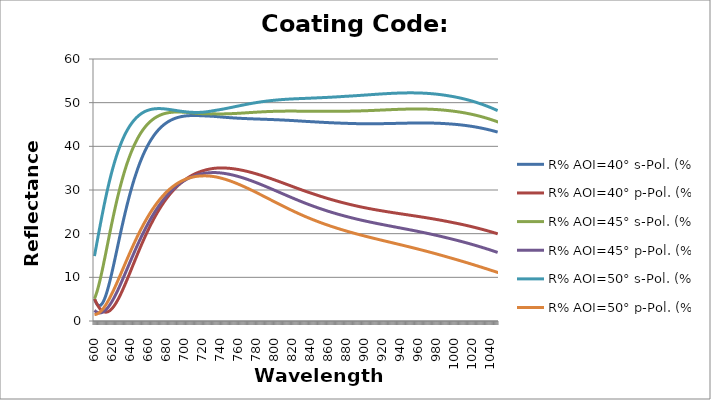
| Category | R% AOI=40° s-Pol. (%) | R% AOI=40° p-Pol. (%) | R% AOI=45° s-Pol. (%) | R% AOI=45° p-Pol. (%) | R% AOI=50° s-Pol. (%) | R% AOI=50° p-Pol. (%) |
|---|---|---|---|---|---|---|
| 600.0 | 5.073 | 5.115 | 5.1 | 2.43 | 14.871 | 1.455 |
| 601.0 | 4.541 | 4.637 | 5.6 | 2.245 | 15.971 | 1.478 |
| 602.0 | 4.118 | 4.199 | 6.181 | 2.094 | 17.081 | 1.531 |
| 603.0 | 3.806 | 3.8 | 6.838 | 1.979 | 18.195 | 1.613 |
| 604.0 | 3.601 | 3.441 | 7.562 | 1.899 | 19.307 | 1.723 |
| 605.0 | 3.503 | 3.123 | 8.346 | 1.853 | 20.414 | 1.861 |
| 606.0 | 3.508 | 2.845 | 9.182 | 1.84 | 21.511 | 2.025 |
| 607.0 | 3.613 | 2.608 | 10.064 | 1.86 | 22.596 | 2.214 |
| 608.0 | 3.813 | 2.411 | 10.984 | 1.913 | 23.664 | 2.427 |
| 609.0 | 4.103 | 2.254 | 11.935 | 1.996 | 24.714 | 2.664 |
| 610.0 | 4.479 | 2.137 | 12.912 | 2.109 | 25.744 | 2.924 |
| 611.0 | 4.933 | 2.059 | 13.909 | 2.252 | 26.751 | 3.204 |
| 612.0 | 5.461 | 2.018 | 14.92 | 2.422 | 27.734 | 3.505 |
| 613.0 | 6.056 | 2.016 | 15.941 | 2.619 | 28.693 | 3.824 |
| 614.0 | 6.712 | 2.05 | 16.966 | 2.842 | 29.625 | 4.162 |
| 615.0 | 7.423 | 2.118 | 17.992 | 3.089 | 30.531 | 4.516 |
| 616.0 | 8.182 | 2.222 | 19.016 | 3.359 | 31.41 | 4.886 |
| 617.0 | 8.984 | 2.358 | 20.032 | 3.651 | 32.261 | 5.27 |
| 618.0 | 9.822 | 2.526 | 21.04 | 3.964 | 33.085 | 5.668 |
| 619.0 | 10.692 | 2.724 | 22.035 | 4.296 | 33.881 | 6.077 |
| 620.0 | 11.587 | 2.951 | 23.016 | 4.646 | 34.649 | 6.498 |
| 621.0 | 12.504 | 3.205 | 23.981 | 5.013 | 35.39 | 6.93 |
| 622.0 | 13.436 | 3.485 | 24.928 | 5.395 | 36.104 | 7.37 |
| 623.0 | 14.38 | 3.79 | 25.856 | 5.792 | 36.791 | 7.818 |
| 624.0 | 15.332 | 4.117 | 26.764 | 6.202 | 37.451 | 8.274 |
| 625.0 | 16.287 | 4.466 | 27.65 | 6.624 | 38.086 | 8.736 |
| 626.0 | 17.243 | 4.835 | 28.514 | 7.056 | 38.695 | 9.203 |
| 627.0 | 18.197 | 5.223 | 29.356 | 7.498 | 39.279 | 9.675 |
| 628.0 | 19.145 | 5.627 | 30.174 | 7.949 | 39.839 | 10.15 |
| 629.0 | 20.086 | 6.047 | 30.968 | 8.407 | 40.375 | 10.628 |
| 630.0 | 21.016 | 6.481 | 31.739 | 8.872 | 40.887 | 11.108 |
| 631.0 | 21.935 | 6.927 | 32.486 | 9.342 | 41.377 | 11.59 |
| 632.0 | 22.84 | 7.386 | 33.21 | 9.818 | 41.845 | 12.072 |
| 633.0 | 23.732 | 7.855 | 33.911 | 10.297 | 42.292 | 12.556 |
| 634.0 | 24.605 | 8.331 | 34.587 | 10.778 | 42.718 | 13.038 |
| 635.0 | 25.458 | 8.814 | 35.238 | 11.26 | 43.122 | 13.517 |
| 636.0 | 26.293 | 9.303 | 35.866 | 11.744 | 43.507 | 13.995 |
| 637.0 | 27.109 | 9.798 | 36.472 | 12.228 | 43.873 | 14.47 |
| 638.0 | 27.906 | 10.297 | 37.056 | 12.712 | 44.221 | 14.943 |
| 639.0 | 28.683 | 10.8 | 37.619 | 13.195 | 44.551 | 15.413 |
| 640.0 | 29.44 | 11.305 | 38.16 | 13.677 | 44.864 | 15.88 |
| 641.0 | 30.176 | 11.812 | 38.68 | 14.158 | 45.16 | 16.342 |
| 642.0 | 30.892 | 12.32 | 39.18 | 14.636 | 45.441 | 16.801 |
| 643.0 | 31.588 | 12.827 | 39.661 | 15.111 | 45.706 | 17.254 |
| 644.0 | 32.263 | 13.334 | 40.122 | 15.583 | 45.955 | 17.703 |
| 645.0 | 32.917 | 13.84 | 40.564 | 16.051 | 46.19 | 18.147 |
| 646.0 | 33.551 | 14.343 | 40.988 | 16.515 | 46.412 | 18.585 |
| 647.0 | 34.165 | 14.844 | 41.394 | 16.975 | 46.619 | 19.018 |
| 648.0 | 34.759 | 15.342 | 41.782 | 17.43 | 46.814 | 19.445 |
| 649.0 | 35.333 | 15.836 | 42.154 | 17.88 | 46.996 | 19.866 |
| 650.0 | 35.888 | 16.326 | 42.509 | 18.325 | 47.166 | 20.28 |
| 651.0 | 36.423 | 16.811 | 42.848 | 18.764 | 47.324 | 20.688 |
| 652.0 | 36.94 | 17.292 | 43.171 | 19.197 | 47.471 | 21.09 |
| 653.0 | 37.439 | 17.766 | 43.48 | 19.624 | 47.607 | 21.484 |
| 654.0 | 37.919 | 18.236 | 43.773 | 20.045 | 47.733 | 21.872 |
| 655.0 | 38.382 | 18.7 | 44.053 | 20.46 | 47.848 | 22.254 |
| 656.0 | 38.828 | 19.157 | 44.319 | 20.868 | 47.954 | 22.628 |
| 657.0 | 39.256 | 19.608 | 44.572 | 21.269 | 48.051 | 22.995 |
| 658.0 | 39.668 | 20.052 | 44.812 | 21.664 | 48.139 | 23.355 |
| 659.0 | 40.065 | 20.489 | 45.039 | 22.052 | 48.219 | 23.708 |
| 660.0 | 40.445 | 20.92 | 45.255 | 22.433 | 48.291 | 24.053 |
| 661.0 | 40.81 | 21.343 | 45.459 | 22.807 | 48.354 | 24.392 |
| 662.0 | 41.161 | 21.759 | 45.651 | 23.174 | 48.411 | 24.723 |
| 663.0 | 41.497 | 22.168 | 45.833 | 23.534 | 48.46 | 25.047 |
| 664.0 | 41.819 | 22.569 | 46.005 | 23.887 | 48.503 | 25.364 |
| 665.0 | 42.127 | 22.963 | 46.166 | 24.233 | 48.54 | 25.674 |
| 666.0 | 42.422 | 23.349 | 46.318 | 24.571 | 48.57 | 25.976 |
| 667.0 | 42.704 | 23.728 | 46.46 | 24.903 | 48.595 | 26.271 |
| 668.0 | 42.974 | 24.099 | 46.593 | 25.227 | 48.614 | 26.559 |
| 669.0 | 43.232 | 24.463 | 46.717 | 25.544 | 48.629 | 26.84 |
| 670.0 | 43.477 | 24.819 | 46.834 | 25.854 | 48.638 | 27.114 |
| 671.0 | 43.712 | 25.167 | 46.942 | 26.158 | 48.643 | 27.381 |
| 672.0 | 43.935 | 25.508 | 47.042 | 26.454 | 48.644 | 27.641 |
| 673.0 | 44.147 | 25.841 | 47.135 | 26.743 | 48.641 | 27.894 |
| 674.0 | 44.349 | 26.166 | 47.221 | 27.025 | 48.634 | 28.14 |
| 675.0 | 44.542 | 26.484 | 47.3 | 27.3 | 48.624 | 28.379 |
| 676.0 | 44.724 | 26.795 | 47.373 | 27.569 | 48.611 | 28.611 |
| 677.0 | 44.897 | 27.098 | 47.439 | 27.83 | 48.595 | 28.837 |
| 678.0 | 45.061 | 27.394 | 47.5 | 28.085 | 48.577 | 29.056 |
| 679.0 | 45.216 | 27.683 | 47.554 | 28.334 | 48.556 | 29.268 |
| 680.0 | 45.362 | 27.965 | 47.604 | 28.576 | 48.533 | 29.474 |
| 681.0 | 45.501 | 28.239 | 47.648 | 28.811 | 48.508 | 29.674 |
| 682.0 | 45.631 | 28.507 | 47.687 | 29.04 | 48.481 | 29.867 |
| 683.0 | 45.754 | 28.767 | 47.721 | 29.262 | 48.453 | 30.054 |
| 684.0 | 45.87 | 29.021 | 47.752 | 29.478 | 48.424 | 30.234 |
| 685.0 | 45.978 | 29.268 | 47.777 | 29.688 | 48.394 | 30.409 |
| 686.0 | 46.08 | 29.508 | 47.799 | 29.892 | 48.363 | 30.577 |
| 687.0 | 46.175 | 29.742 | 47.818 | 30.089 | 48.331 | 30.739 |
| 688.0 | 46.264 | 29.969 | 47.832 | 30.281 | 48.299 | 30.896 |
| 689.0 | 46.346 | 30.189 | 47.844 | 30.467 | 48.267 | 31.046 |
| 690.0 | 46.423 | 30.404 | 47.852 | 30.647 | 48.234 | 31.191 |
| 691.0 | 46.495 | 30.612 | 47.858 | 30.821 | 48.202 | 31.33 |
| 692.0 | 46.56 | 30.814 | 47.86 | 30.989 | 48.17 | 31.463 |
| 693.0 | 46.621 | 31.01 | 47.861 | 31.152 | 48.138 | 31.591 |
| 694.0 | 46.677 | 31.2 | 47.859 | 31.31 | 48.107 | 31.714 |
| 695.0 | 46.728 | 31.384 | 47.854 | 31.461 | 48.077 | 31.831 |
| 696.0 | 46.775 | 31.562 | 47.848 | 31.608 | 48.048 | 31.942 |
| 697.0 | 46.817 | 31.735 | 47.84 | 31.749 | 48.019 | 32.049 |
| 698.0 | 46.855 | 31.902 | 47.831 | 31.885 | 47.991 | 32.15 |
| 699.0 | 46.89 | 32.064 | 47.82 | 32.016 | 47.965 | 32.246 |
| 700.0 | 46.92 | 32.22 | 47.808 | 32.142 | 47.94 | 32.338 |
| 701.0 | 46.947 | 32.371 | 47.794 | 32.263 | 47.916 | 32.424 |
| 702.0 | 46.971 | 32.517 | 47.779 | 32.379 | 47.894 | 32.505 |
| 703.0 | 46.991 | 32.658 | 47.764 | 32.49 | 47.873 | 32.582 |
| 704.0 | 47.009 | 32.793 | 47.748 | 32.597 | 47.854 | 32.654 |
| 705.0 | 47.023 | 32.924 | 47.731 | 32.699 | 47.836 | 32.721 |
| 706.0 | 47.035 | 33.05 | 47.714 | 32.796 | 47.82 | 32.784 |
| 707.0 | 47.044 | 33.171 | 47.696 | 32.888 | 47.806 | 32.842 |
| 708.0 | 47.051 | 33.287 | 47.678 | 32.977 | 47.794 | 32.896 |
| 709.0 | 47.056 | 33.399 | 47.66 | 33.061 | 47.784 | 32.946 |
| 710.0 | 47.059 | 33.506 | 47.642 | 33.14 | 47.776 | 32.991 |
| 711.0 | 47.059 | 33.609 | 47.624 | 33.216 | 47.769 | 33.032 |
| 712.0 | 47.058 | 33.708 | 47.606 | 33.287 | 47.765 | 33.069 |
| 713.0 | 47.055 | 33.802 | 47.588 | 33.354 | 47.762 | 33.102 |
| 714.0 | 47.05 | 33.892 | 47.571 | 33.417 | 47.762 | 33.131 |
| 715.0 | 47.044 | 33.978 | 47.554 | 33.476 | 47.764 | 33.156 |
| 716.0 | 47.037 | 34.06 | 47.537 | 33.532 | 47.767 | 33.178 |
| 717.0 | 47.029 | 34.138 | 47.521 | 33.583 | 47.772 | 33.195 |
| 718.0 | 47.019 | 34.212 | 47.505 | 33.631 | 47.78 | 33.209 |
| 719.0 | 47.008 | 34.282 | 47.49 | 33.675 | 47.789 | 33.219 |
| 720.0 | 47 | 34.351 | 47.48 | 33.718 | 47.805 | 33.228 |
| 721.0 | 46.992 | 34.417 | 47.471 | 33.759 | 47.823 | 33.235 |
| 722.0 | 46.983 | 34.48 | 47.463 | 33.796 | 47.843 | 33.238 |
| 723.0 | 46.974 | 34.539 | 47.456 | 33.829 | 47.865 | 33.239 |
| 724.0 | 46.964 | 34.595 | 47.45 | 33.86 | 47.889 | 33.236 |
| 725.0 | 46.954 | 34.647 | 47.444 | 33.887 | 47.914 | 33.229 |
| 726.0 | 46.944 | 34.696 | 47.44 | 33.911 | 47.942 | 33.22 |
| 727.0 | 46.933 | 34.742 | 47.436 | 33.932 | 47.971 | 33.208 |
| 728.0 | 46.922 | 34.786 | 47.434 | 33.95 | 48.001 | 33.192 |
| 729.0 | 46.911 | 34.825 | 47.432 | 33.965 | 48.034 | 33.174 |
| 730.0 | 46.9 | 34.862 | 47.432 | 33.977 | 48.068 | 33.153 |
| 731.0 | 46.888 | 34.896 | 47.432 | 33.986 | 48.103 | 33.129 |
| 732.0 | 46.877 | 34.927 | 47.434 | 33.992 | 48.14 | 33.102 |
| 733.0 | 46.866 | 34.956 | 47.436 | 33.996 | 48.178 | 33.072 |
| 734.0 | 46.852 | 34.98 | 47.437 | 33.995 | 48.214 | 33.039 |
| 735.0 | 46.834 | 34.997 | 47.433 | 33.988 | 48.245 | 33.001 |
| 736.0 | 46.815 | 35.012 | 47.429 | 33.979 | 48.276 | 32.96 |
| 737.0 | 46.796 | 35.025 | 47.427 | 33.968 | 48.309 | 32.916 |
| 738.0 | 46.778 | 35.034 | 47.425 | 33.954 | 48.343 | 32.87 |
| 739.0 | 46.76 | 35.042 | 47.424 | 33.937 | 48.378 | 32.822 |
| 740.0 | 46.742 | 35.046 | 47.424 | 33.918 | 48.414 | 32.772 |
| 741.0 | 46.724 | 35.049 | 47.424 | 33.896 | 48.45 | 32.719 |
| 742.0 | 46.706 | 35.049 | 47.426 | 33.873 | 48.487 | 32.664 |
| 743.0 | 46.689 | 35.047 | 47.428 | 33.847 | 48.525 | 32.608 |
| 744.0 | 46.672 | 35.042 | 47.431 | 33.819 | 48.564 | 32.549 |
| 745.0 | 46.655 | 35.035 | 47.434 | 33.789 | 48.603 | 32.487 |
| 746.0 | 46.638 | 35.026 | 47.439 | 33.756 | 48.643 | 32.425 |
| 747.0 | 46.622 | 35.015 | 47.444 | 33.722 | 48.684 | 32.36 |
| 748.0 | 46.606 | 35.002 | 47.45 | 33.685 | 48.724 | 32.293 |
| 749.0 | 46.59 | 34.987 | 47.456 | 33.647 | 48.766 | 32.224 |
| 750.0 | 46.575 | 34.969 | 47.463 | 33.606 | 48.807 | 32.154 |
| 751.0 | 46.56 | 34.95 | 47.471 | 33.564 | 48.849 | 32.082 |
| 752.0 | 46.546 | 34.929 | 47.479 | 33.52 | 48.891 | 32.008 |
| 753.0 | 46.532 | 34.906 | 47.488 | 33.474 | 48.934 | 31.933 |
| 754.0 | 46.518 | 34.881 | 47.497 | 33.426 | 48.976 | 31.856 |
| 755.0 | 46.505 | 34.854 | 47.507 | 33.377 | 49.019 | 31.778 |
| 756.0 | 46.492 | 34.826 | 47.517 | 33.326 | 49.061 | 31.698 |
| 757.0 | 46.479 | 34.796 | 47.527 | 33.273 | 49.104 | 31.616 |
| 758.0 | 46.467 | 34.764 | 47.538 | 33.219 | 49.147 | 31.534 |
| 759.0 | 46.455 | 34.73 | 47.55 | 33.163 | 49.189 | 31.449 |
| 760.0 | 46.443 | 34.695 | 47.561 | 33.106 | 49.232 | 31.364 |
| 761.0 | 46.432 | 34.659 | 47.573 | 33.047 | 49.274 | 31.277 |
| 762.0 | 46.421 | 34.62 | 47.585 | 32.987 | 49.316 | 31.19 |
| 763.0 | 46.41 | 34.581 | 47.598 | 32.925 | 49.358 | 31.101 |
| 764.0 | 46.4 | 34.54 | 47.611 | 32.862 | 49.4 | 31.01 |
| 765.0 | 46.39 | 34.497 | 47.623 | 32.798 | 49.441 | 30.919 |
| 766.0 | 46.38 | 34.453 | 47.636 | 32.732 | 49.482 | 30.827 |
| 767.0 | 46.37 | 34.408 | 47.65 | 32.665 | 49.523 | 30.734 |
| 768.0 | 46.361 | 34.361 | 47.663 | 32.597 | 49.563 | 30.64 |
| 769.0 | 46.352 | 34.313 | 47.676 | 32.528 | 49.603 | 30.545 |
| 770.0 | 46.343 | 34.264 | 47.69 | 32.458 | 49.643 | 30.449 |
| 771.0 | 46.335 | 34.213 | 47.703 | 32.386 | 49.682 | 30.352 |
| 772.0 | 46.326 | 34.162 | 47.716 | 32.314 | 49.72 | 30.254 |
| 773.0 | 46.318 | 34.109 | 47.73 | 32.241 | 49.758 | 30.156 |
| 774.0 | 46.31 | 34.055 | 47.743 | 32.166 | 49.796 | 30.057 |
| 775.0 | 46.302 | 34 | 47.756 | 32.091 | 49.832 | 29.958 |
| 776.0 | 46.294 | 33.944 | 47.769 | 32.014 | 49.869 | 29.857 |
| 777.0 | 46.286 | 33.886 | 47.782 | 31.937 | 49.905 | 29.756 |
| 778.0 | 46.279 | 33.828 | 47.795 | 31.859 | 49.94 | 29.655 |
| 779.0 | 46.271 | 33.769 | 47.808 | 31.78 | 49.974 | 29.553 |
| 780.0 | 46.264 | 33.709 | 47.82 | 31.701 | 50.008 | 29.45 |
| 781.0 | 46.257 | 33.648 | 47.833 | 31.62 | 50.042 | 29.348 |
| 782.0 | 46.25 | 33.586 | 47.845 | 31.539 | 50.074 | 29.244 |
| 783.0 | 46.242 | 33.523 | 47.857 | 31.458 | 50.106 | 29.141 |
| 784.0 | 46.235 | 33.46 | 47.869 | 31.375 | 50.138 | 29.036 |
| 785.0 | 46.228 | 33.395 | 47.88 | 31.292 | 50.168 | 28.932 |
| 786.0 | 46.221 | 33.33 | 47.891 | 31.209 | 50.198 | 28.828 |
| 787.0 | 46.213 | 33.264 | 47.902 | 31.124 | 50.228 | 28.723 |
| 788.0 | 46.206 | 33.198 | 47.913 | 31.04 | 50.256 | 28.618 |
| 789.0 | 46.199 | 33.13 | 47.923 | 30.955 | 50.284 | 28.512 |
| 790.0 | 46.191 | 33.062 | 47.933 | 30.869 | 50.312 | 28.407 |
| 791.0 | 46.184 | 32.994 | 47.942 | 30.783 | 50.338 | 28.302 |
| 792.0 | 46.176 | 32.924 | 47.952 | 30.697 | 50.364 | 28.196 |
| 793.0 | 46.169 | 32.854 | 47.961 | 30.61 | 50.39 | 28.09 |
| 794.0 | 46.161 | 32.784 | 47.969 | 30.523 | 50.414 | 27.984 |
| 795.0 | 46.153 | 32.713 | 47.977 | 30.435 | 50.438 | 27.879 |
| 796.0 | 46.146 | 32.642 | 47.985 | 30.348 | 50.461 | 27.773 |
| 797.0 | 46.138 | 32.57 | 47.993 | 30.26 | 50.484 | 27.668 |
| 798.0 | 46.129 | 32.498 | 48 | 30.172 | 50.506 | 27.562 |
| 799.0 | 46.121 | 32.425 | 48.007 | 30.083 | 50.527 | 27.457 |
| 800.0 | 46.113 | 32.352 | 48.013 | 29.994 | 50.548 | 27.351 |
| 801.0 | 46.104 | 32.278 | 48.019 | 29.906 | 50.568 | 27.246 |
| 802.0 | 46.096 | 32.204 | 48.025 | 29.817 | 50.588 | 27.141 |
| 803.0 | 46.087 | 32.13 | 48.03 | 29.728 | 50.607 | 27.036 |
| 804.0 | 46.078 | 32.056 | 48.035 | 29.639 | 50.625 | 26.932 |
| 805.0 | 46.068 | 31.981 | 48.04 | 29.55 | 50.643 | 26.828 |
| 806.0 | 46.059 | 31.906 | 48.044 | 29.461 | 50.66 | 26.724 |
| 807.0 | 46.05 | 31.83 | 48.048 | 29.372 | 50.677 | 26.62 |
| 808.0 | 46.04 | 31.755 | 48.051 | 29.283 | 50.693 | 26.517 |
| 809.0 | 46.03 | 31.679 | 48.055 | 29.194 | 50.709 | 26.414 |
| 810.0 | 46.02 | 31.603 | 48.057 | 29.105 | 50.724 | 26.311 |
| 811.0 | 46.01 | 31.527 | 48.06 | 29.016 | 50.739 | 26.209 |
| 812.0 | 45.999 | 31.451 | 48.062 | 28.927 | 50.753 | 26.107 |
| 813.0 | 45.989 | 31.375 | 48.064 | 28.839 | 50.767 | 26.005 |
| 814.0 | 45.978 | 31.299 | 48.065 | 28.75 | 50.78 | 25.904 |
| 815.0 | 45.967 | 31.222 | 48.066 | 28.662 | 50.793 | 25.804 |
| 816.0 | 45.956 | 31.146 | 48.067 | 28.574 | 50.805 | 25.703 |
| 817.0 | 45.945 | 31.069 | 48.068 | 28.486 | 50.817 | 25.604 |
| 818.0 | 45.933 | 30.993 | 48.068 | 28.398 | 50.829 | 25.504 |
| 819.0 | 45.922 | 30.916 | 48.068 | 28.311 | 50.84 | 25.406 |
| 820.0 | 45.91 | 30.84 | 48.068 | 28.224 | 50.851 | 25.308 |
| 821.0 | 45.898 | 30.764 | 48.067 | 28.137 | 50.861 | 25.21 |
| 822.0 | 45.886 | 30.687 | 48.066 | 28.051 | 50.872 | 25.113 |
| 823.0 | 45.874 | 30.611 | 48.065 | 27.964 | 50.881 | 25.016 |
| 824.0 | 45.861 | 30.535 | 48.064 | 27.879 | 50.891 | 24.92 |
| 825.0 | 45.849 | 30.459 | 48.062 | 27.793 | 50.9 | 24.825 |
| 826.0 | 45.836 | 30.383 | 48.061 | 27.708 | 50.91 | 24.73 |
| 827.0 | 45.823 | 30.307 | 48.059 | 27.623 | 50.918 | 24.636 |
| 828.0 | 45.81 | 30.232 | 48.057 | 27.539 | 50.927 | 24.542 |
| 829.0 | 45.798 | 30.157 | 48.054 | 27.455 | 50.936 | 24.449 |
| 830.0 | 45.784 | 30.082 | 48.052 | 27.371 | 50.944 | 24.357 |
| 831.0 | 45.771 | 30.007 | 48.05 | 27.288 | 50.952 | 24.265 |
| 832.0 | 45.758 | 29.932 | 48.047 | 27.205 | 50.96 | 24.174 |
| 833.0 | 45.744 | 29.858 | 48.044 | 27.123 | 50.968 | 24.083 |
| 834.0 | 45.731 | 29.784 | 48.041 | 27.042 | 50.975 | 23.994 |
| 835.0 | 45.719 | 29.712 | 48.04 | 26.962 | 50.984 | 23.906 |
| 836.0 | 45.708 | 29.64 | 48.038 | 26.883 | 50.994 | 23.819 |
| 837.0 | 45.696 | 29.569 | 48.037 | 26.805 | 51.003 | 23.733 |
| 838.0 | 45.685 | 29.498 | 48.036 | 26.727 | 51.012 | 23.648 |
| 839.0 | 45.673 | 29.427 | 48.034 | 26.65 | 51.021 | 23.563 |
| 840.0 | 45.662 | 29.357 | 48.033 | 26.573 | 51.03 | 23.479 |
| 841.0 | 45.65 | 29.287 | 48.032 | 26.496 | 51.039 | 23.396 |
| 842.0 | 45.638 | 29.218 | 48.03 | 26.421 | 51.048 | 23.313 |
| 843.0 | 45.627 | 29.149 | 48.028 | 26.346 | 51.056 | 23.231 |
| 844.0 | 45.615 | 29.08 | 48.027 | 26.271 | 51.065 | 23.149 |
| 845.0 | 45.603 | 29.012 | 48.025 | 26.197 | 51.074 | 23.068 |
| 846.0 | 45.592 | 28.944 | 48.024 | 26.123 | 51.083 | 22.988 |
| 847.0 | 45.58 | 28.876 | 48.022 | 26.05 | 51.092 | 22.909 |
| 848.0 | 45.568 | 28.809 | 48.021 | 25.978 | 51.101 | 22.83 |
| 849.0 | 45.557 | 28.742 | 48.02 | 25.906 | 51.11 | 22.752 |
| 850.0 | 45.546 | 28.676 | 48.018 | 25.834 | 51.119 | 22.674 |
| 851.0 | 45.534 | 28.61 | 48.017 | 25.764 | 51.129 | 22.598 |
| 852.0 | 45.523 | 28.545 | 48.016 | 25.694 | 51.138 | 22.522 |
| 853.0 | 45.512 | 28.48 | 48.015 | 25.624 | 51.147 | 22.446 |
| 854.0 | 45.501 | 28.416 | 48.014 | 25.555 | 51.157 | 22.371 |
| 855.0 | 45.49 | 28.352 | 48.013 | 25.487 | 51.167 | 22.297 |
| 856.0 | 45.479 | 28.288 | 48.012 | 25.419 | 51.176 | 22.224 |
| 857.0 | 45.468 | 28.225 | 48.012 | 25.352 | 51.186 | 22.15 |
| 858.0 | 45.458 | 28.163 | 48.012 | 25.285 | 51.196 | 22.078 |
| 859.0 | 45.447 | 28.101 | 48.011 | 25.219 | 51.207 | 22.007 |
| 860.0 | 45.437 | 28.04 | 48.011 | 25.154 | 51.217 | 21.936 |
| 861.0 | 45.427 | 27.979 | 48.011 | 25.089 | 51.228 | 21.865 |
| 862.0 | 45.417 | 27.918 | 48.012 | 25.025 | 51.238 | 21.795 |
| 863.0 | 45.407 | 27.858 | 48.012 | 24.961 | 51.249 | 21.726 |
| 864.0 | 45.398 | 27.799 | 48.013 | 24.898 | 51.26 | 21.658 |
| 865.0 | 45.388 | 27.74 | 48.013 | 24.836 | 51.271 | 21.59 |
| 866.0 | 45.379 | 27.682 | 48.014 | 24.774 | 51.283 | 21.522 |
| 867.0 | 45.37 | 27.624 | 48.016 | 24.712 | 51.294 | 21.455 |
| 868.0 | 45.361 | 27.567 | 48.017 | 24.652 | 51.306 | 21.389 |
| 869.0 | 45.353 | 27.51 | 48.019 | 24.592 | 51.318 | 21.323 |
| 870.0 | 45.344 | 27.454 | 48.021 | 24.532 | 51.33 | 21.258 |
| 871.0 | 45.336 | 27.398 | 48.023 | 24.473 | 51.342 | 21.194 |
| 872.0 | 45.329 | 27.343 | 48.025 | 24.415 | 51.355 | 21.129 |
| 873.0 | 45.321 | 27.289 | 48.028 | 24.357 | 51.367 | 21.066 |
| 874.0 | 45.314 | 27.235 | 48.031 | 24.3 | 51.38 | 21.003 |
| 875.0 | 45.307 | 27.181 | 48.034 | 24.243 | 51.393 | 20.94 |
| 876.0 | 45.3 | 27.128 | 48.037 | 24.187 | 51.406 | 20.878 |
| 877.0 | 45.294 | 27.076 | 48.041 | 24.131 | 51.42 | 20.817 |
| 878.0 | 45.287 | 27.024 | 48.044 | 24.076 | 51.433 | 20.756 |
| 879.0 | 45.281 | 26.972 | 48.048 | 24.021 | 51.447 | 20.695 |
| 880.0 | 45.272 | 26.92 | 48.05 | 23.966 | 51.458 | 20.635 |
| 881.0 | 45.264 | 26.869 | 48.052 | 23.912 | 51.47 | 20.574 |
| 882.0 | 45.257 | 26.818 | 48.054 | 23.858 | 51.482 | 20.515 |
| 883.0 | 45.249 | 26.767 | 48.057 | 23.804 | 51.494 | 20.455 |
| 884.0 | 45.242 | 26.717 | 48.06 | 23.751 | 51.506 | 20.396 |
| 885.0 | 45.236 | 26.668 | 48.063 | 23.699 | 51.519 | 20.338 |
| 886.0 | 45.229 | 26.618 | 48.066 | 23.647 | 51.531 | 20.28 |
| 887.0 | 45.223 | 26.57 | 48.07 | 23.595 | 51.544 | 20.222 |
| 888.0 | 45.217 | 26.522 | 48.074 | 23.544 | 51.557 | 20.165 |
| 889.0 | 45.212 | 26.475 | 48.078 | 23.494 | 51.57 | 20.108 |
| 890.0 | 45.207 | 26.428 | 48.082 | 23.444 | 51.583 | 20.052 |
| 891.0 | 45.202 | 26.382 | 48.087 | 23.394 | 51.597 | 19.996 |
| 892.0 | 45.197 | 26.336 | 48.092 | 23.345 | 51.61 | 19.94 |
| 893.0 | 45.193 | 26.29 | 48.097 | 23.296 | 51.624 | 19.885 |
| 894.0 | 45.189 | 26.245 | 48.103 | 23.248 | 51.638 | 19.83 |
| 895.0 | 45.186 | 26.201 | 48.109 | 23.2 | 51.652 | 19.775 |
| 896.0 | 45.183 | 26.157 | 48.115 | 23.153 | 51.666 | 19.721 |
| 897.0 | 45.18 | 26.114 | 48.121 | 23.106 | 51.68 | 19.667 |
| 898.0 | 45.177 | 26.071 | 48.127 | 23.059 | 51.694 | 19.613 |
| 899.0 | 45.175 | 26.028 | 48.134 | 23.013 | 51.708 | 19.56 |
| 900.0 | 45.173 | 25.986 | 48.141 | 22.967 | 51.722 | 19.507 |
| 901.0 | 45.171 | 25.945 | 48.148 | 22.922 | 51.737 | 19.454 |
| 902.0 | 45.17 | 25.904 | 48.155 | 22.876 | 51.751 | 19.401 |
| 903.0 | 45.169 | 25.863 | 48.162 | 22.832 | 51.766 | 19.349 |
| 904.0 | 45.168 | 25.822 | 48.17 | 22.787 | 51.78 | 19.297 |
| 905.0 | 45.168 | 25.783 | 48.178 | 22.743 | 51.794 | 19.245 |
| 906.0 | 45.168 | 25.743 | 48.186 | 22.699 | 51.809 | 19.194 |
| 907.0 | 45.168 | 25.704 | 48.194 | 22.656 | 51.823 | 19.142 |
| 908.0 | 45.168 | 25.666 | 48.202 | 22.612 | 51.838 | 19.091 |
| 909.0 | 45.169 | 25.627 | 48.211 | 22.57 | 51.852 | 19.04 |
| 910.0 | 45.17 | 25.589 | 48.219 | 22.527 | 51.866 | 18.989 |
| 911.0 | 45.171 | 25.552 | 48.228 | 22.485 | 51.88 | 18.938 |
| 912.0 | 45.173 | 25.515 | 48.237 | 22.443 | 51.894 | 18.888 |
| 913.0 | 45.174 | 25.478 | 48.246 | 22.401 | 51.909 | 18.837 |
| 914.0 | 45.176 | 25.441 | 48.255 | 22.359 | 51.922 | 18.787 |
| 915.0 | 45.178 | 25.405 | 48.264 | 22.318 | 51.936 | 18.737 |
| 916.0 | 45.181 | 25.369 | 48.273 | 22.276 | 51.95 | 18.687 |
| 917.0 | 45.183 | 25.334 | 48.282 | 22.236 | 51.964 | 18.637 |
| 918.0 | 45.186 | 25.298 | 48.291 | 22.195 | 51.977 | 18.588 |
| 919.0 | 45.189 | 25.264 | 48.3 | 22.154 | 51.99 | 18.538 |
| 920.0 | 45.192 | 25.229 | 48.31 | 22.114 | 52.003 | 18.488 |
| 921.0 | 45.196 | 25.194 | 48.319 | 22.074 | 52.016 | 18.439 |
| 922.0 | 45.199 | 25.16 | 48.328 | 22.033 | 52.029 | 18.389 |
| 923.0 | 45.203 | 25.126 | 48.337 | 21.993 | 52.041 | 18.34 |
| 924.0 | 45.206 | 25.093 | 48.347 | 21.954 | 52.053 | 18.291 |
| 925.0 | 45.21 | 25.059 | 48.356 | 21.914 | 52.065 | 18.242 |
| 926.0 | 45.214 | 25.026 | 48.365 | 21.874 | 52.077 | 18.192 |
| 927.0 | 45.218 | 24.993 | 48.374 | 21.835 | 52.088 | 18.143 |
| 928.0 | 45.223 | 24.96 | 48.383 | 21.795 | 52.1 | 18.094 |
| 929.0 | 45.227 | 24.928 | 48.392 | 21.756 | 52.11 | 18.045 |
| 930.0 | 45.232 | 24.896 | 48.401 | 21.717 | 52.121 | 17.996 |
| 931.0 | 45.236 | 24.863 | 48.41 | 21.678 | 52.131 | 17.946 |
| 932.0 | 45.241 | 24.831 | 48.418 | 21.638 | 52.141 | 17.897 |
| 933.0 | 45.245 | 24.799 | 48.426 | 21.6 | 52.15 | 17.848 |
| 934.0 | 45.25 | 24.768 | 48.435 | 21.56 | 52.16 | 17.799 |
| 935.0 | 45.255 | 24.736 | 48.443 | 21.521 | 52.168 | 17.75 |
| 936.0 | 45.26 | 24.704 | 48.451 | 21.482 | 52.177 | 17.7 |
| 937.0 | 45.264 | 24.673 | 48.459 | 21.443 | 52.185 | 17.651 |
| 938.0 | 45.269 | 24.642 | 48.466 | 21.404 | 52.192 | 17.602 |
| 939.0 | 45.274 | 24.61 | 48.474 | 21.365 | 52.199 | 17.552 |
| 940.0 | 45.278 | 24.579 | 48.481 | 21.326 | 52.206 | 17.502 |
| 941.0 | 45.283 | 24.548 | 48.488 | 21.287 | 52.212 | 17.453 |
| 942.0 | 45.288 | 24.517 | 48.494 | 21.248 | 52.218 | 17.403 |
| 943.0 | 45.292 | 24.486 | 48.501 | 21.209 | 52.223 | 17.353 |
| 944.0 | 45.297 | 24.455 | 48.507 | 21.17 | 52.228 | 17.303 |
| 945.0 | 45.301 | 24.424 | 48.512 | 21.13 | 52.232 | 17.253 |
| 946.0 | 45.305 | 24.393 | 48.518 | 21.091 | 52.236 | 17.203 |
| 947.0 | 45.309 | 24.362 | 48.523 | 21.051 | 52.239 | 17.153 |
| 948.0 | 45.313 | 24.332 | 48.528 | 21.012 | 52.242 | 17.103 |
| 949.0 | 45.317 | 24.301 | 48.532 | 20.972 | 52.244 | 17.052 |
| 950.0 | 45.321 | 24.27 | 48.537 | 20.932 | 52.245 | 17.002 |
| 951.0 | 45.325 | 24.239 | 48.54 | 20.892 | 52.246 | 16.951 |
| 952.0 | 45.328 | 24.208 | 48.544 | 20.852 | 52.246 | 16.9 |
| 953.0 | 45.331 | 24.177 | 48.547 | 20.812 | 52.246 | 16.849 |
| 954.0 | 45.334 | 24.146 | 48.549 | 20.772 | 52.245 | 16.798 |
| 955.0 | 45.337 | 24.114 | 48.552 | 20.731 | 52.244 | 16.747 |
| 956.0 | 45.34 | 24.083 | 48.553 | 20.691 | 52.241 | 16.695 |
| 957.0 | 45.342 | 24.052 | 48.555 | 20.65 | 52.238 | 16.644 |
| 958.0 | 45.344 | 24.02 | 48.555 | 20.609 | 52.235 | 16.592 |
| 959.0 | 45.346 | 23.988 | 48.556 | 20.568 | 52.231 | 16.54 |
| 960.0 | 45.347 | 23.957 | 48.556 | 20.526 | 52.226 | 16.488 |
| 961.0 | 45.349 | 23.925 | 48.555 | 20.485 | 52.22 | 16.435 |
| 962.0 | 45.35 | 23.893 | 48.554 | 20.443 | 52.214 | 16.383 |
| 963.0 | 45.35 | 23.861 | 48.552 | 20.401 | 52.207 | 16.33 |
| 964.0 | 45.351 | 23.829 | 48.55 | 20.359 | 52.199 | 16.277 |
| 965.0 | 45.351 | 23.796 | 48.548 | 20.316 | 52.191 | 16.224 |
| 966.0 | 45.35 | 23.764 | 48.544 | 20.274 | 52.182 | 16.171 |
| 967.0 | 45.35 | 23.731 | 48.54 | 20.231 | 52.172 | 16.117 |
| 968.0 | 45.348 | 23.698 | 48.536 | 20.188 | 52.161 | 16.064 |
| 969.0 | 45.347 | 23.664 | 48.531 | 20.145 | 52.149 | 16.01 |
| 970.0 | 45.345 | 23.631 | 48.526 | 20.101 | 52.137 | 15.956 |
| 971.0 | 45.343 | 23.598 | 48.519 | 20.057 | 52.124 | 15.902 |
| 972.0 | 45.34 | 23.564 | 48.513 | 20.013 | 52.11 | 15.847 |
| 973.0 | 45.337 | 23.53 | 48.505 | 19.969 | 52.095 | 15.792 |
| 974.0 | 45.334 | 23.495 | 48.497 | 19.924 | 52.08 | 15.737 |
| 975.0 | 45.33 | 23.461 | 48.488 | 19.879 | 52.063 | 15.682 |
| 976.0 | 45.325 | 23.426 | 48.479 | 19.834 | 52.046 | 15.627 |
| 977.0 | 45.32 | 23.391 | 48.469 | 19.788 | 52.028 | 15.571 |
| 978.0 | 45.315 | 23.356 | 48.458 | 19.743 | 52.009 | 15.516 |
| 979.0 | 45.309 | 23.32 | 48.447 | 19.696 | 51.989 | 15.46 |
| 980.0 | 45.302 | 23.284 | 48.435 | 19.65 | 51.968 | 15.403 |
| 981.0 | 45.296 | 23.248 | 48.422 | 19.603 | 51.946 | 15.347 |
| 982.0 | 45.288 | 23.212 | 48.409 | 19.556 | 51.924 | 15.29 |
| 983.0 | 45.28 | 23.175 | 48.394 | 19.509 | 51.9 | 15.233 |
| 984.0 | 45.272 | 23.138 | 48.379 | 19.461 | 51.876 | 15.176 |
| 985.0 | 45.262 | 23.1 | 48.364 | 19.413 | 51.851 | 15.119 |
| 986.0 | 45.253 | 23.062 | 48.347 | 19.365 | 51.824 | 15.061 |
| 987.0 | 45.242 | 23.024 | 48.33 | 19.316 | 51.797 | 15.003 |
| 988.0 | 45.232 | 22.986 | 48.312 | 19.268 | 51.769 | 14.945 |
| 989.0 | 45.22 | 22.947 | 48.293 | 19.218 | 51.74 | 14.887 |
| 990.0 | 45.208 | 22.908 | 48.273 | 19.169 | 51.71 | 14.828 |
| 991.0 | 45.195 | 22.869 | 48.253 | 19.119 | 51.679 | 14.77 |
| 992.0 | 45.182 | 22.829 | 48.232 | 19.068 | 51.647 | 14.71 |
| 993.0 | 45.168 | 22.789 | 48.209 | 19.018 | 51.614 | 14.651 |
| 994.0 | 45.153 | 22.748 | 48.186 | 18.967 | 51.58 | 14.592 |
| 995.0 | 45.139 | 22.709 | 48.164 | 18.916 | 51.546 | 14.533 |
| 996.0 | 45.125 | 22.67 | 48.142 | 18.867 | 51.512 | 14.475 |
| 997.0 | 45.111 | 22.63 | 48.119 | 18.817 | 51.478 | 14.417 |
| 998.0 | 45.096 | 22.59 | 48.095 | 18.766 | 51.442 | 14.359 |
| 999.0 | 45.08 | 22.55 | 48.07 | 18.716 | 51.406 | 14.3 |
| 1000.0 | 45.064 | 22.509 | 48.044 | 18.665 | 51.368 | 14.242 |
| 1001.0 | 45.047 | 22.468 | 48.018 | 18.613 | 51.329 | 14.182 |
| 1002.0 | 45.029 | 22.426 | 47.99 | 18.561 | 51.29 | 14.123 |
| 1003.0 | 45.01 | 22.385 | 47.962 | 18.509 | 51.249 | 14.064 |
| 1004.0 | 44.991 | 22.342 | 47.933 | 18.457 | 51.207 | 14.004 |
| 1005.0 | 44.971 | 22.3 | 47.903 | 18.404 | 51.164 | 13.944 |
| 1006.0 | 44.95 | 22.256 | 47.872 | 18.35 | 51.121 | 13.884 |
| 1007.0 | 44.929 | 22.213 | 47.84 | 18.297 | 51.076 | 13.824 |
| 1008.0 | 44.906 | 22.169 | 47.807 | 18.243 | 51.03 | 13.763 |
| 1009.0 | 44.883 | 22.124 | 47.773 | 18.188 | 50.983 | 13.702 |
| 1010.0 | 44.859 | 22.08 | 47.739 | 18.134 | 50.935 | 13.641 |
| 1011.0 | 44.835 | 22.034 | 47.703 | 18.078 | 50.886 | 13.58 |
| 1012.0 | 44.809 | 21.988 | 47.666 | 18.023 | 50.835 | 13.518 |
| 1013.0 | 44.783 | 21.942 | 47.629 | 17.967 | 50.784 | 13.457 |
| 1014.0 | 44.756 | 21.896 | 47.591 | 17.911 | 50.732 | 13.395 |
| 1015.0 | 44.728 | 21.848 | 47.551 | 17.854 | 50.678 | 13.333 |
| 1016.0 | 44.7 | 21.801 | 47.511 | 17.797 | 50.624 | 13.27 |
| 1017.0 | 44.67 | 21.753 | 47.47 | 17.74 | 50.568 | 13.208 |
| 1018.0 | 44.64 | 21.705 | 47.428 | 17.682 | 50.511 | 13.145 |
| 1019.0 | 44.609 | 21.656 | 47.384 | 17.624 | 50.453 | 13.083 |
| 1020.0 | 44.577 | 21.606 | 47.34 | 17.565 | 50.394 | 13.02 |
| 1021.0 | 44.545 | 21.556 | 47.295 | 17.506 | 50.334 | 12.956 |
| 1022.0 | 44.511 | 21.506 | 47.249 | 17.447 | 50.273 | 12.893 |
| 1023.0 | 44.476 | 21.456 | 47.202 | 17.388 | 50.21 | 12.829 |
| 1024.0 | 44.441 | 21.404 | 47.153 | 17.328 | 50.147 | 12.766 |
| 1025.0 | 44.405 | 21.353 | 47.104 | 17.267 | 50.082 | 12.702 |
| 1026.0 | 44.368 | 21.3 | 47.054 | 17.206 | 50.016 | 12.638 |
| 1027.0 | 44.33 | 21.248 | 47.003 | 17.145 | 49.949 | 12.573 |
| 1028.0 | 44.291 | 21.195 | 46.95 | 17.084 | 49.881 | 12.509 |
| 1029.0 | 44.252 | 21.141 | 46.897 | 17.022 | 49.812 | 12.444 |
| 1030.0 | 44.211 | 21.087 | 46.843 | 16.96 | 49.741 | 12.379 |
| 1031.0 | 44.169 | 21.033 | 46.788 | 16.897 | 49.67 | 12.314 |
| 1032.0 | 44.127 | 20.978 | 46.731 | 16.834 | 49.597 | 12.249 |
| 1033.0 | 44.084 | 20.922 | 46.674 | 16.771 | 49.523 | 12.184 |
| 1034.0 | 44.04 | 20.866 | 46.615 | 16.707 | 49.448 | 12.119 |
| 1035.0 | 43.994 | 20.81 | 46.556 | 16.643 | 49.372 | 12.053 |
| 1036.0 | 43.948 | 20.753 | 46.495 | 16.579 | 49.294 | 11.988 |
| 1037.0 | 43.901 | 20.696 | 46.434 | 16.514 | 49.216 | 11.922 |
| 1038.0 | 43.853 | 20.638 | 46.371 | 16.449 | 49.136 | 11.856 |
| 1039.0 | 43.804 | 20.579 | 46.307 | 16.384 | 49.055 | 11.79 |
| 1040.0 | 43.755 | 20.521 | 46.242 | 16.318 | 48.972 | 11.724 |
| 1041.0 | 43.704 | 20.461 | 46.176 | 16.252 | 48.889 | 11.657 |
| 1042.0 | 43.652 | 20.402 | 46.11 | 16.186 | 48.804 | 11.591 |
| 1043.0 | 43.6 | 20.341 | 46.042 | 16.119 | 48.719 | 11.524 |
| 1044.0 | 43.546 | 20.281 | 45.972 | 16.052 | 48.632 | 11.458 |
| 1045.0 | 43.491 | 20.219 | 45.902 | 15.984 | 48.543 | 11.391 |
| 1046.0 | 43.436 | 20.158 | 45.831 | 15.916 | 48.454 | 11.324 |
| 1047.0 | 43.379 | 20.096 | 45.758 | 15.848 | 48.363 | 11.257 |
| 1048.0 | 43.322 | 20.033 | 45.685 | 15.78 | 48.271 | 11.19 |
| 1049.0 | 43.263 | 19.97 | 45.61 | 15.711 | 48.178 | 11.123 |
| 1050.0 | 43.204 | 19.906 | 45.535 | 15.642 | 48.084 | 11.056 |